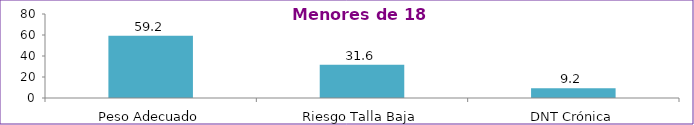
| Category | Series 0 |
|---|---|
| Peso Adecuado | 59.2 |
| Riesgo Talla Baja | 31.6 |
| DNT Crónica | 9.2 |